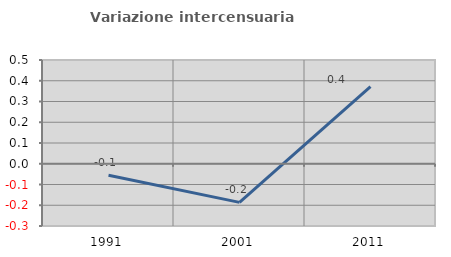
| Category | Variazione intercensuaria annua |
|---|---|
| 1991.0 | -0.055 |
| 2001.0 | -0.186 |
| 2011.0 | 0.372 |